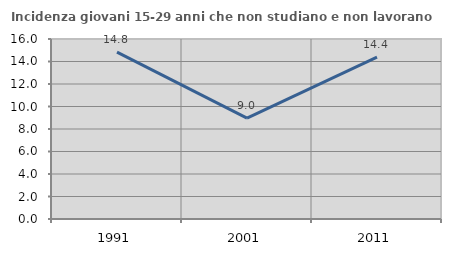
| Category | Incidenza giovani 15-29 anni che non studiano e non lavorano  |
|---|---|
| 1991.0 | 14.833 |
| 2001.0 | 8.962 |
| 2011.0 | 14.384 |